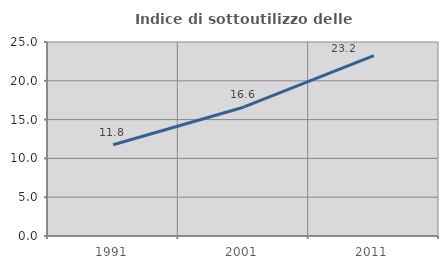
| Category | Indice di sottoutilizzo delle abitazioni  |
|---|---|
| 1991.0 | 11.752 |
| 2001.0 | 16.597 |
| 2011.0 | 23.246 |